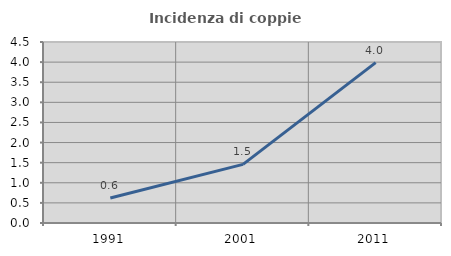
| Category | Incidenza di coppie miste |
|---|---|
| 1991.0 | 0.623 |
| 2001.0 | 1.458 |
| 2011.0 | 3.989 |